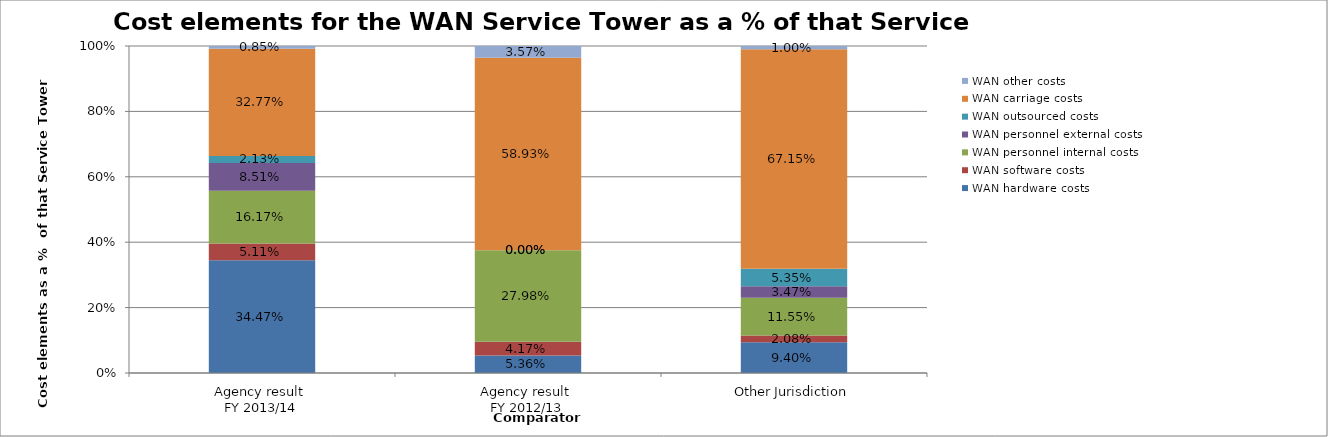
| Category | WAN hardware costs | WAN software costs | WAN personnel internal costs | WAN personnel external costs | WAN outsourced costs | WAN carriage costs | WAN other costs |
|---|---|---|---|---|---|---|---|
| Agency result 
FY 2013/14 | 0.345 | 0.051 | 0.162 | 0.085 | 0.021 | 0.328 | 0.008 |
| Agency result 
FY 2012/13 | 0.054 | 0.042 | 0.28 | 0 | 0 | 0.589 | 0.036 |
| Other Jurisdiction | 0.094 | 0.021 | 0.116 | 0.035 | 0.054 | 0.672 | 0.01 |